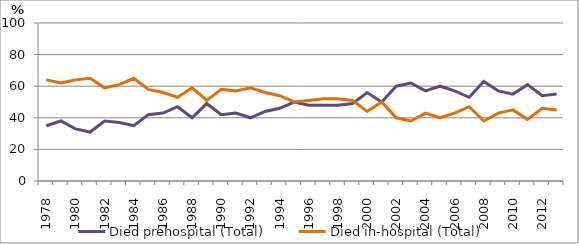
| Category | Died prehospital (Total) | Died in-hospital (Total) |
|---|---|---|
| 1978.0 | 35 | 64 |
| 1979.0 | 38 | 62 |
| 1980.0 | 33 | 64 |
| 1981.0 | 31 | 65 |
| 1982.0 | 38 | 59 |
| 1983.0 | 37 | 61 |
| 1984.0 | 35 | 65 |
| 1985.0 | 42 | 58 |
| 1986.0 | 43 | 56 |
| 1987.0 | 47 | 53 |
| 1988.0 | 40 | 59 |
| 1989.0 | 49 | 51 |
| 1990.0 | 42 | 58 |
| 1991.0 | 43 | 57 |
| 1992.0 | 40 | 59 |
| 1993.0 | 44 | 56 |
| 1994.0 | 46 | 54 |
| 1995.0 | 50 | 50 |
| 1996.0 | 48 | 51 |
| 1997.0 | 48 | 52 |
| 1998.0 | 48 | 52 |
| 1999.0 | 49 | 51 |
| 2000.0 | 56 | 44 |
| 2001.0 | 50 | 50 |
| 2002.0 | 60 | 40 |
| 2003.0 | 62 | 38 |
| 2004.0 | 57 | 43 |
| 2005.0 | 60 | 40 |
| 2006.0 | 57 | 43 |
| 2007.0 | 53 | 47 |
| 2008.0 | 63 | 38 |
| 2009.0 | 57 | 43 |
| 2010.0 | 55 | 45 |
| 2011.0 | 61 | 39 |
| 2012.0 | 54 | 46 |
| 2013.0 | 55 | 45 |